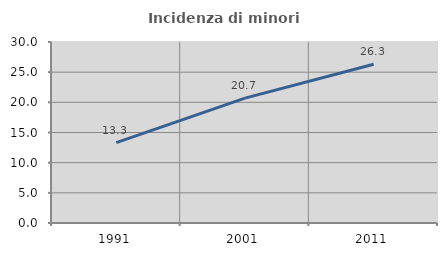
| Category | Incidenza di minori stranieri |
|---|---|
| 1991.0 | 13.333 |
| 2001.0 | 20.69 |
| 2011.0 | 26.316 |